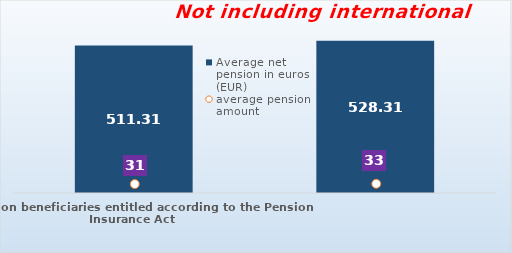
| Category | Average net pension in euros (EUR)  |
|---|---|
| Pension beneficiaries entitled according to the Pension Insurance Act   | 511.31 |
| Pension beneficiaries entitled to pension FOR THE FIRST TIME in 2023 according to the Pension Insurance Act  - NEW BENEFICIARIES | 528.314 |